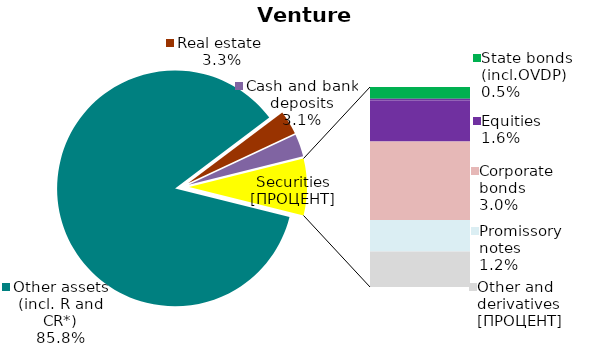
| Category | Series 0 |
|---|---|
| Other assets (incl. R and CR*) | 0.858 |
| Real estate  | 0.033 |
| Cash and bank deposits | 0.031 |
| Bank metals | 0 |
| State bonds (incl.OVDP) | 0.005 |
| Municipal bonds | 0.001 |
| Equities | 0.016 |
| Corporate bonds | 0.03 |
| Promissory notes | 0.012 |
| Other securities & derivatives | 0.014 |